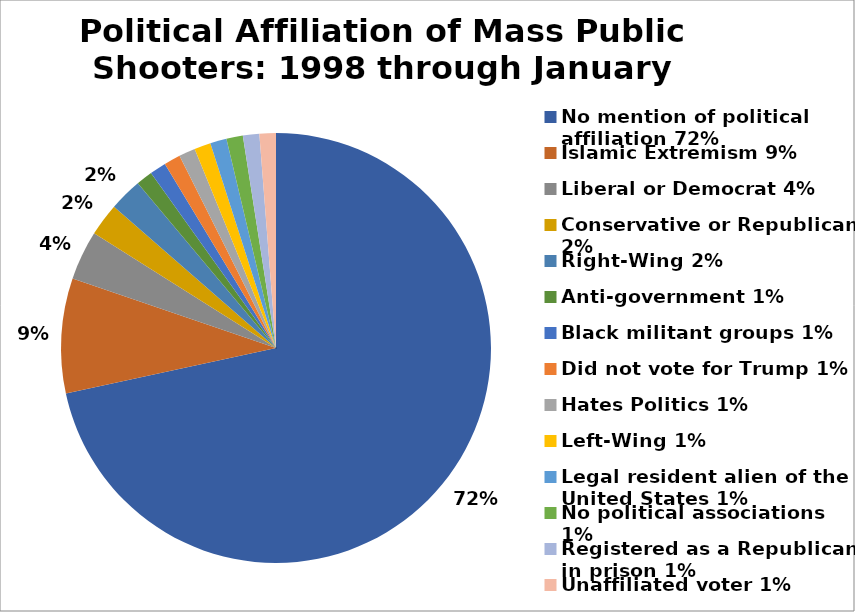
| Category | Series 0 |
|---|---|
| No mention of political affiliation 72% | 0.716 |
| Islamic Extremism 9% | 0.086 |
| Liberal or Democrat 4% | 0.037 |
| Conservative or Republican 2% | 0.025 |
| Right-Wing 2% | 0.025 |
| Anti-government 1% | 0.012 |
| Black militant groups 1% | 0.012 |
| Did not vote for Trump 1% | 0.012 |
| Hates Politics 1% | 0.012 |
| Left-Wing 1% | 0.012 |
| Legal resident alien of the United States 1% | 0.012 |
| No political associations 1% | 0.012 |
| Registered as a Republican in prison 1% | 0.012 |
| Unaffiliated voter 1% | 0.012 |